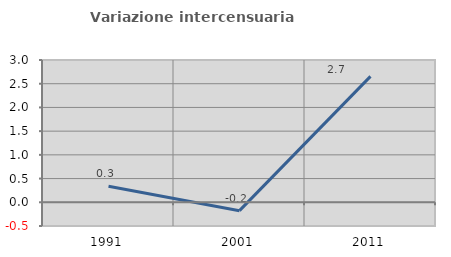
| Category | Variazione intercensuaria annua |
|---|---|
| 1991.0 | 0.339 |
| 2001.0 | -0.177 |
| 2011.0 | 2.654 |